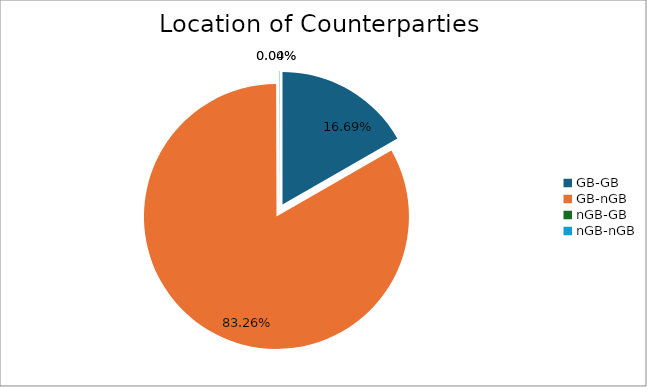
| Category | Series 0 |
|---|---|
| GB-GB | 1645138.334 |
| GB-nGB | 8206324.404 |
| nGB-GB | 0 |
| nGB-nGB | 4394.712 |